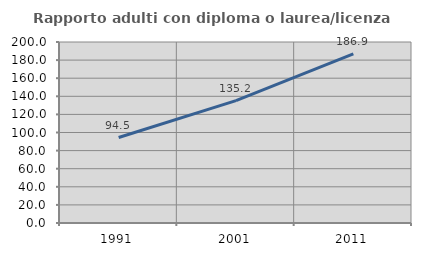
| Category | Rapporto adulti con diploma o laurea/licenza media  |
|---|---|
| 1991.0 | 94.468 |
| 2001.0 | 135.156 |
| 2011.0 | 186.918 |